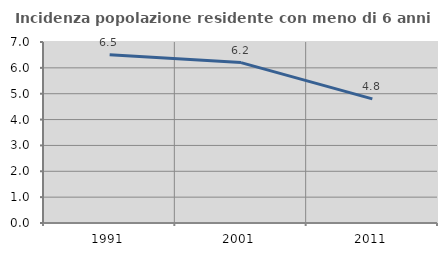
| Category | Incidenza popolazione residente con meno di 6 anni |
|---|---|
| 1991.0 | 6.508 |
| 2001.0 | 6.204 |
| 2011.0 | 4.801 |